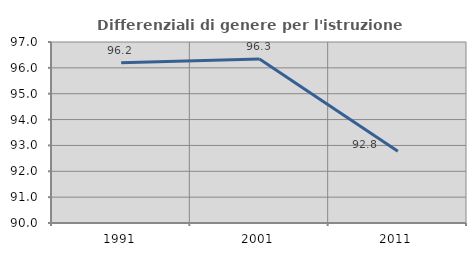
| Category | Differenziali di genere per l'istruzione superiore |
|---|---|
| 1991.0 | 96.2 |
| 2001.0 | 96.345 |
| 2011.0 | 92.78 |